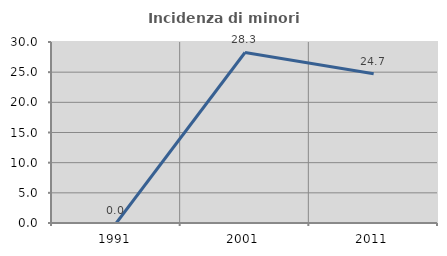
| Category | Incidenza di minori stranieri |
|---|---|
| 1991.0 | 0 |
| 2001.0 | 28.261 |
| 2011.0 | 24.725 |